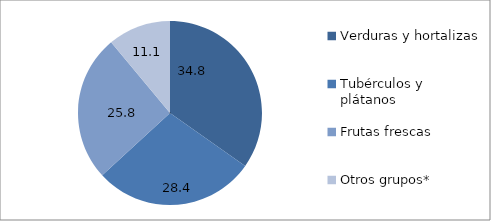
| Category | Abastecimiento mensual Bogotá |
|---|---|
| Verduras y hortalizas  | 34.776 |
| Tubérculos y plátanos  | 28.407 |
| Frutas frescas  | 25.76 |
| Otros grupos* | 11.056 |